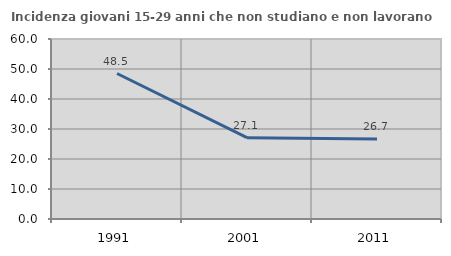
| Category | Incidenza giovani 15-29 anni che non studiano e non lavorano  |
|---|---|
| 1991.0 | 48.496 |
| 2001.0 | 27.119 |
| 2011.0 | 26.667 |